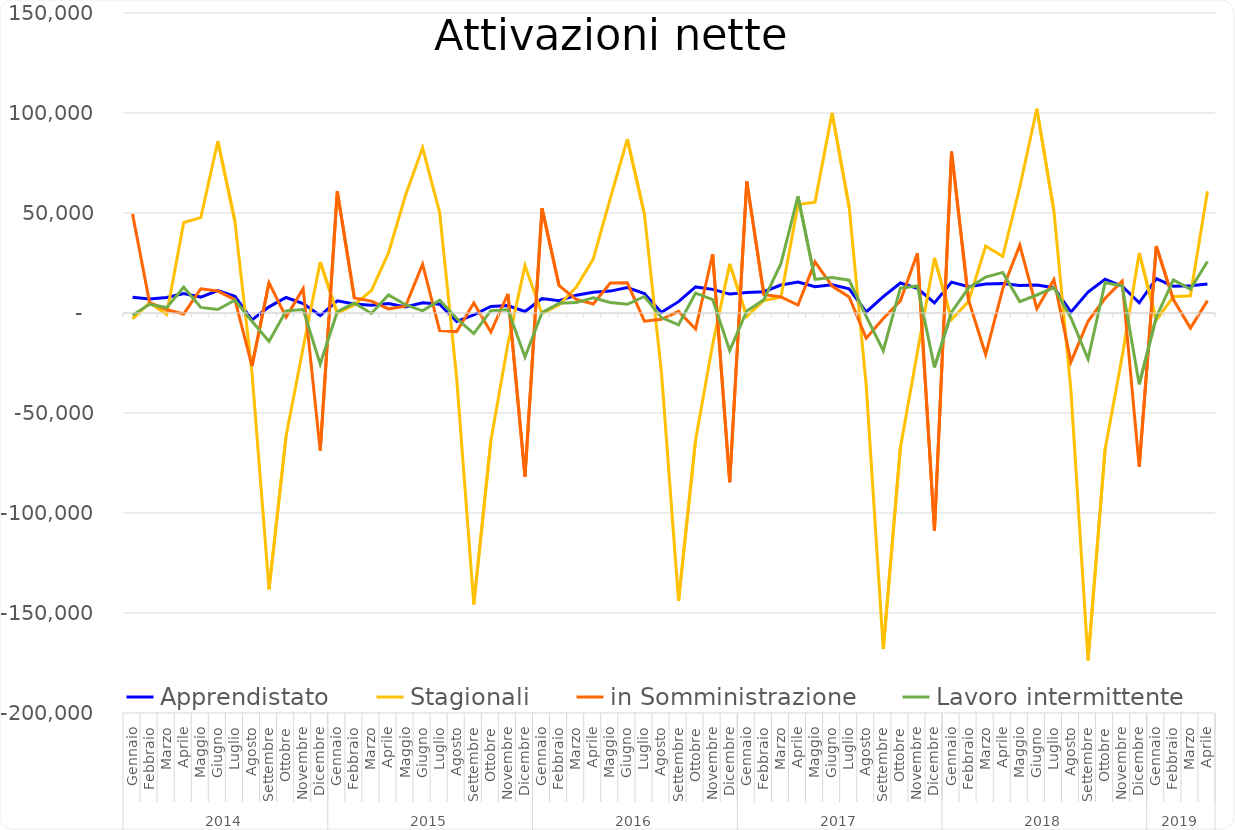
| Category | Apprendistato | Stagionali | in Somministrazione | Lavoro intermittente |
|---|---|---|---|---|
| 0 | 7863 | -2920 | 49472 | -1101 |
| 1 | 6955 | 5163 | 5178 | 4322 |
| 2 | 7721 | -748 | 1634 | 2706 |
| 3 | 9758 | 45226 | -471 | 12908 |
| 4 | 7956 | 47688 | 12121 | 2776 |
| 5 | 11246 | 85873 | 10963 | 1733 |
| 6 | 8345 | 45937 | 6677 | 6462 |
| 7 | -3479 | -29751 | -26473 | -4141 |
| 8 | 3067 | -138156 | 15089 | -14209 |
| 9 | 7763 | -61478 | -2060 | 1076 |
| 10 | 4748 | -17330 | 12180 | 1697 |
| 11 | -1268 | 25518 | -68837 | -25505 |
| 12 | 6076 | -214 | 60873 | 654 |
| 13 | 4532 | 4115 | 7507 | 5064 |
| 14 | 3912 | 11182 | 5965 | -203 |
| 15 | 4773 | 30005 | 2077 | 9052 |
| 16 | 3043 | 58845 | 3381 | 4123 |
| 17 | 5065 | 82610 | 24417 | 1091 |
| 18 | 4354 | 50198 | -8770 | 6418 |
| 19 | -4239 | -32824 | -9290 | -2762 |
| 20 | -957 | -145714 | 4975 | -10299 |
| 21 | 3276 | -64012 | -9545 | 1193 |
| 22 | 3742 | -15380 | 9528 | 1636 |
| 23 | 749 | 23615 | -81840 | -21957 |
| 24 | 7218 | -342 | 52332 | 218 |
| 25 | 6179 | 4121 | 13625 | 4859 |
| 26 | 8908 | 12870 | 6774 | 5191 |
| 27 | 10411 | 26959 | 4483 | 7588 |
| 28 | 10950 | 57270 | 14984 | 5292 |
| 29 | 12722 | 86964 | 15100 | 4350 |
| 30 | 9769 | 49429 | -4114 | 8259 |
| 31 | 303 | -29813 | -3128 | -2315 |
| 32 | 5673 | -143890 | 798 | -5892 |
| 33 | 13054 | -63436 | -8029 | 9957 |
| 34 | 11822 | -15589 | 29480 | 6733 |
| 35 | 9459 | 24547 | -84618 | -18780 |
| 36 | 10205 | -1725 | 65825 | 1036 |
| 37 | 10635 | 6266 | 9207 | 6634 |
| 38 | 13986 | 7907 | 8068 | 24638 |
| 39 | 15486 | 54190 | 4000 | 58337 |
| 40 | 13178 | 55431 | 25538 | 16843 |
| 41 | 14131 | 100053 | 13467 | 17722 |
| 42 | 12055 | 52938 | 7986 | 16391 |
| 43 | 522 | -36345 | -12569 | -1673 |
| 44 | 8189 | -167942 | -2774 | -18879 |
| 45 | 15012 | -67438 | 6007 | 12459 |
| 46 | 12309 | -19484 | 29830 | 13552 |
| 47 | 5052 | 27551 | -108893 | -27183 |
| 48 | 15417 | -3272 | 80703 | 402 |
| 49 | 13094 | 5808 | 6427 | 12538 |
| 50 | 14549 | 33473 | -20781 | 17982 |
| 51 | 14803 | 28245 | 12054 | 20293 |
| 52 | 13796 | 63000 | 33918 | 5688 |
| 53 | 14040 | 102127 | 2182 | 9002 |
| 54 | 12666 | 51042 | 16735 | 12705 |
| 55 | 439 | -39049 | -24473 | -2484 |
| 56 | 10504 | -173679 | -4146 | -23076 |
| 57 | 16898 | -68219 | 7350 | 15120 |
| 58 | 13411 | -21724 | 15925 | 13575 |
| 59 | 5099 | 30038 | -76891 | -35671 |
| 60 | 17213 | -3574 | 33496 | -2112 |
| 61 | 13330 | 8118 | 6682 | 16555 |
| 62 | 13640 | 8571 | -7513 | 11883 |
| 63 | 14556 | 60883 | 6180 | 25708 |